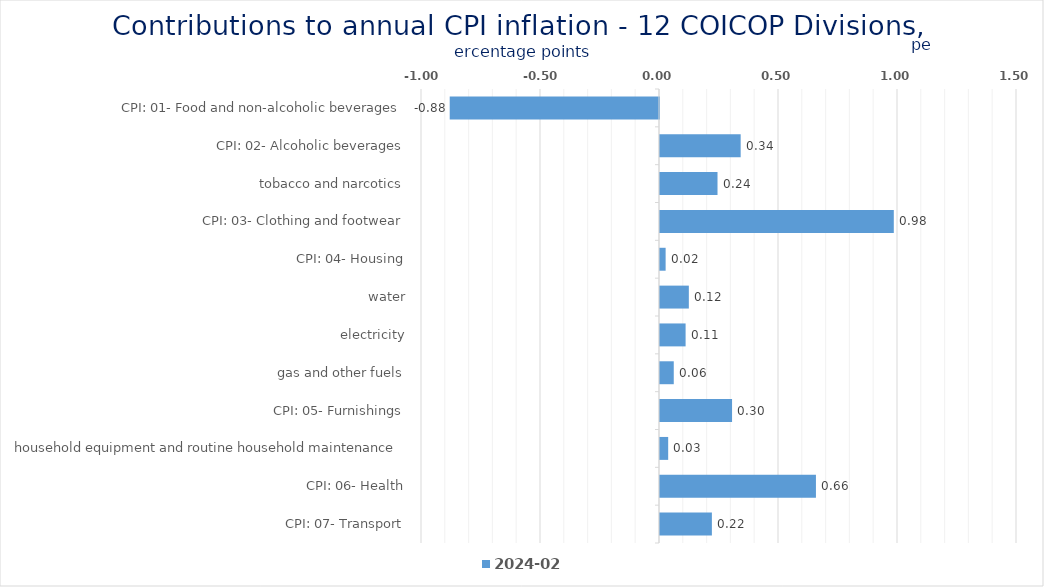
| Category | 2024-02 |
|---|---|
| CPI: 01- Food and non-alcoholic beverages | -0.879 |
| CPI: 02- Alcoholic beverages, tobacco and narcotics | 0.339 |
| CPI: 03- Clothing and footwear | 0.242 |
| CPI: 04- Housing, water, electricity, gas and other fuels | 0.982 |
| CPI: 05- Furnishings, household equipment and routine household maintenance | 0.024 |
| CPI: 06- Health | 0.121 |
| CPI: 07- Transport | 0.108 |
| CPI: 08- Communication | 0.058 |
| CPI: 09- Recreation and culture | 0.303 |
| CPI: 10- Education | 0.034 |
| CPI: 11- Restaurants and hotels | 0.655 |
| CPI: 12- Miscellaneous goods and services | 0.218 |